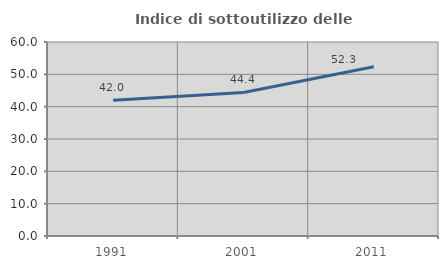
| Category | Indice di sottoutilizzo delle abitazioni  |
|---|---|
| 1991.0 | 41.954 |
| 2001.0 | 44.405 |
| 2011.0 | 52.326 |